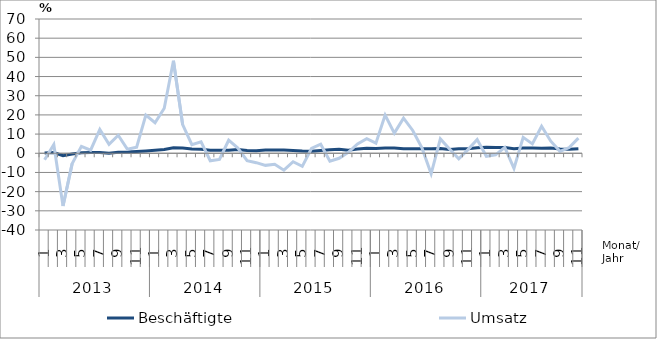
| Category | Beschäftigte | Umsatz |
|---|---|---|
| 0 | 0.1 | -3.4 |
| 1 | 0.4 | 4.5 |
| 2 | -1.3 | -27.5 |
| 3 | -0.4 | -5.3 |
| 4 | 0.3 | 3.6 |
| 5 | 0.4 | 1.6 |
| 6 | 0.4 | 12.4 |
| 7 | 0 | 4.7 |
| 8 | 0.5 | 9.4 |
| 9 | 0.6 | 2.1 |
| 10 | 0.9 | 3.2 |
| 11 | 1.2 | 19.9 |
| 12 | 1.6 | 15.9 |
| 13 | 2 | 23.5 |
| 14 | 2.9 | 48.2 |
| 15 | 2.8 | 14.9 |
| 16 | 2.2 | 4.5 |
| 17 | 2.1 | 6 |
| 18 | 1.6 | -3.9 |
| 19 | 1.6 | -3.2 |
| 20 | 1.6 | 6.8 |
| 21 | 2 | 2.7 |
| 22 | 1.4 | -3.9 |
| 23 | 1.3 | -4.9 |
| 24 | 1.7 | -6.3 |
| 25 | 1.7 | -5.7 |
| 26 | 1.7 | -8.8 |
| 27 | 1.5 | -4.4 |
| 28 | 1.2 | -6.8 |
| 29 | 1.1 | 2.5 |
| 30 | 1.5 | 4.7 |
| 31 | 1.8 | -4.1 |
| 32 | 2.1 | -2.6 |
| 33 | 1.6 | 0.5 |
| 34 | 2.2 | 4.9 |
| 35 | 2.6 | 7.6 |
| 36 | 2.5 | 5.3 |
| 37 | 2.7 | 19.9 |
| 38 | 2.8 | 10.5 |
| 39 | 2.4 | 18.3 |
| 40 | 2.4 | 11.9 |
| 41 | 2.4 | 2.8 |
| 42 | 2.3 | -10.7 |
| 43 | 2.5 | 7.5 |
| 44 | 2 | 2.2 |
| 45 | 2.4 | -2.9 |
| 46 | 2.3 | 1.9 |
| 47 | 2.9 | 7.2 |
| 48 | 3.1 | -1.6 |
| 49 | 3 | -0.8 |
| 50 | 3 | 3.1 |
| 51 | 2.4 | -7.9 |
| 52 | 2.8 | 8.3 |
| 53 | 2.7 | 4.9 |
| 54 | 2.6 | 14.1 |
| 55 | 2.7 | 6.3 |
| 56 | 2.2 | 1 |
| 57 | 2.1 | 3 |
| 58 | 2.4 | 7.9 |